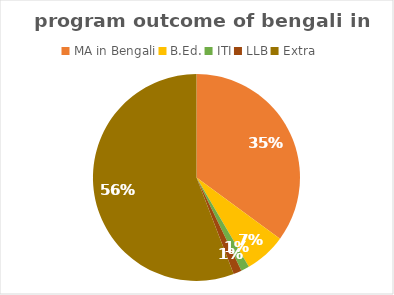
| Category | Series 0 |
|---|---|
| MA in Bengali | 27 |
| B.Ed. | 5 |
| ITI | 1 |
| LLB | 1 |
| Extra | 43 |